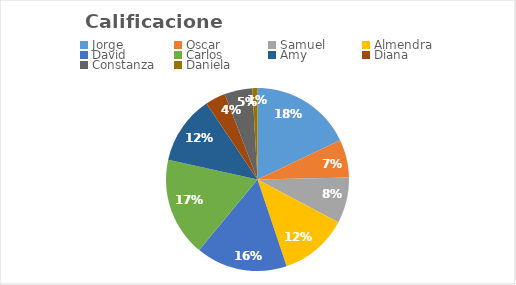
| Category | Calificaciones |
|---|---|
| Jorge | 20 |
| Oscar | 14.75 |
| Samuel | 12 |
| Almendra | 19.25 |
| David | 18.5 |
| Carlos | 20.5 |
| Amy | 17.5 |
| Diana | 12 |
| Constanza | 12.5 |
| Daniela | 12.5 |